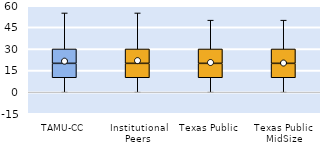
| Category | 25th | 50th | 75th |
|---|---|---|---|
| TAMU-CC | 10 | 10 | 10 |
| Institutional Peers | 10 | 10 | 10 |
| Texas Public | 10 | 10 | 10 |
| Texas Public MidSize | 10 | 10 | 10 |